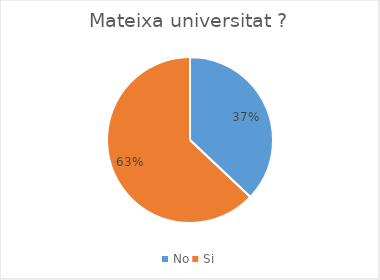
| Category | Series 0 |
|---|---|
| No | 10 |
| Si | 17 |